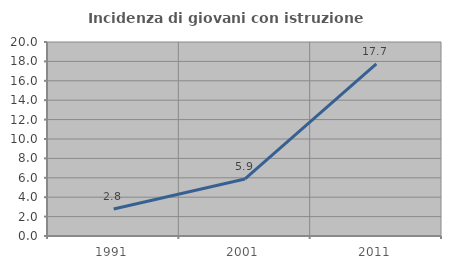
| Category | Incidenza di giovani con istruzione universitaria |
|---|---|
| 1991.0 | 2.778 |
| 2001.0 | 5.882 |
| 2011.0 | 17.742 |